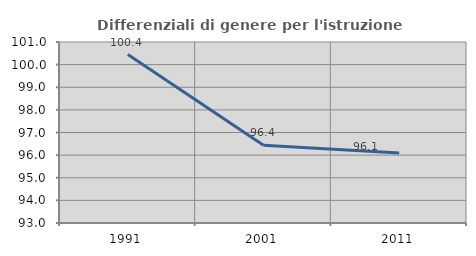
| Category | Differenziali di genere per l'istruzione superiore |
|---|---|
| 1991.0 | 100.443 |
| 2001.0 | 96.436 |
| 2011.0 | 96.092 |